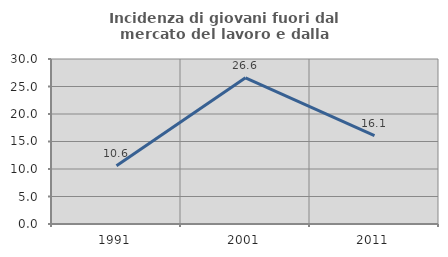
| Category | Incidenza di giovani fuori dal mercato del lavoro e dalla formazione  |
|---|---|
| 1991.0 | 10.581 |
| 2001.0 | 26.588 |
| 2011.0 | 16.058 |